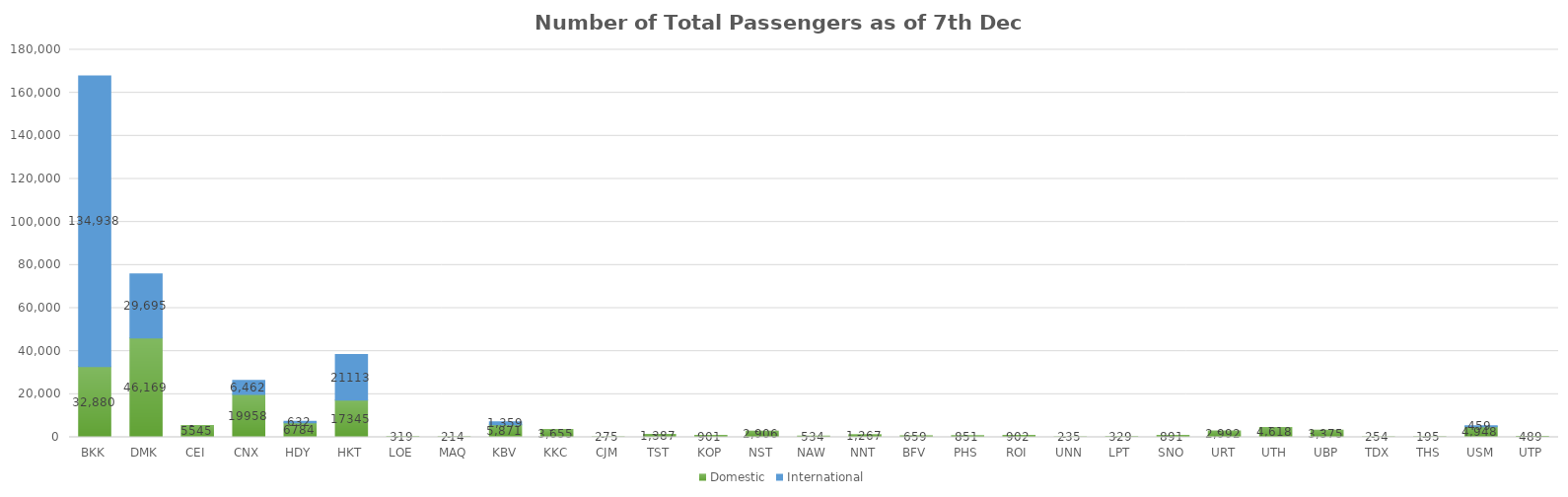
| Category | Domestic | International |
|---|---|---|
| BKK | 32880 | 134938 |
| DMK | 46169 | 29695 |
| CEI | 5545 | 0 |
| CNX | 19958 | 6462 |
| HDY | 6784 | 632 |
| HKT | 17345 | 21113 |
| LOE | 319 | 0 |
| MAQ | 214 | 0 |
| KBV | 5871 | 1359 |
| KKC | 3655 | 0 |
| CJM | 275 | 0 |
| TST | 1387 | 0 |
| KOP | 901 | 0 |
| NST | 2906 | 0 |
| NAW | 534 | 0 |
| NNT | 1267 | 0 |
| BFV | 659 | 0 |
| PHS | 851 | 0 |
| ROI | 902 | 0 |
| UNN | 235 | 0 |
| LPT | 329 | 0 |
| SNO | 891 | 0 |
| URT | 2992 | 0 |
| UTH | 4618 | 0 |
| UBP | 3375 | 0 |
| TDX | 254 | 0 |
| THS | 195 | 0 |
| USM | 4948 | 459 |
| UTP | 489 | 0 |